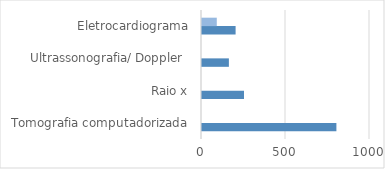
| Category | Series 0 | Series 1 |
|---|---|---|
| Tomografia computadorizada | 800 | 0 |
| Raio x | 250 | 0 |
| Ultrassonografia/ Doppler  | 160 | 0 |
| Eletrocardiograma | 200 | 88 |